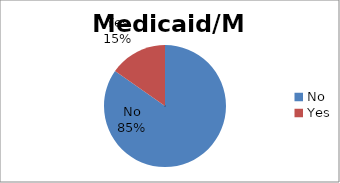
| Category | Series 0 |
|---|---|
| No | 84.721 |
| Yes | 15.279 |